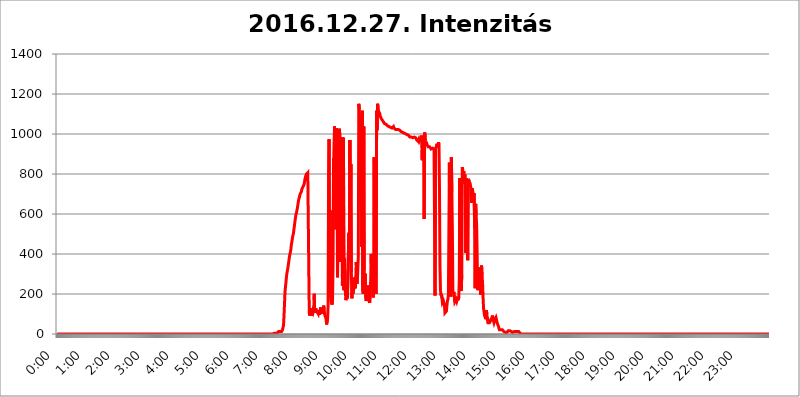
| Category | 2016.12.27. Intenzitás [W/m^2] |
|---|---|
| 0.0 | 0 |
| 0.0006944444444444445 | 0 |
| 0.001388888888888889 | 0 |
| 0.0020833333333333333 | 0 |
| 0.002777777777777778 | 0 |
| 0.003472222222222222 | 0 |
| 0.004166666666666667 | 0 |
| 0.004861111111111111 | 0 |
| 0.005555555555555556 | 0 |
| 0.0062499999999999995 | 0 |
| 0.006944444444444444 | 0 |
| 0.007638888888888889 | 0 |
| 0.008333333333333333 | 0 |
| 0.009027777777777779 | 0 |
| 0.009722222222222222 | 0 |
| 0.010416666666666666 | 0 |
| 0.011111111111111112 | 0 |
| 0.011805555555555555 | 0 |
| 0.012499999999999999 | 0 |
| 0.013194444444444444 | 0 |
| 0.013888888888888888 | 0 |
| 0.014583333333333332 | 0 |
| 0.015277777777777777 | 0 |
| 0.015972222222222224 | 0 |
| 0.016666666666666666 | 0 |
| 0.017361111111111112 | 0 |
| 0.018055555555555557 | 0 |
| 0.01875 | 0 |
| 0.019444444444444445 | 0 |
| 0.02013888888888889 | 0 |
| 0.020833333333333332 | 0 |
| 0.02152777777777778 | 0 |
| 0.022222222222222223 | 0 |
| 0.02291666666666667 | 0 |
| 0.02361111111111111 | 0 |
| 0.024305555555555556 | 0 |
| 0.024999999999999998 | 0 |
| 0.025694444444444447 | 0 |
| 0.02638888888888889 | 0 |
| 0.027083333333333334 | 0 |
| 0.027777777777777776 | 0 |
| 0.02847222222222222 | 0 |
| 0.029166666666666664 | 0 |
| 0.029861111111111113 | 0 |
| 0.030555555555555555 | 0 |
| 0.03125 | 0 |
| 0.03194444444444445 | 0 |
| 0.03263888888888889 | 0 |
| 0.03333333333333333 | 0 |
| 0.034027777777777775 | 0 |
| 0.034722222222222224 | 0 |
| 0.035416666666666666 | 0 |
| 0.036111111111111115 | 0 |
| 0.03680555555555556 | 0 |
| 0.0375 | 0 |
| 0.03819444444444444 | 0 |
| 0.03888888888888889 | 0 |
| 0.03958333333333333 | 0 |
| 0.04027777777777778 | 0 |
| 0.04097222222222222 | 0 |
| 0.041666666666666664 | 0 |
| 0.042361111111111106 | 0 |
| 0.04305555555555556 | 0 |
| 0.043750000000000004 | 0 |
| 0.044444444444444446 | 0 |
| 0.04513888888888889 | 0 |
| 0.04583333333333334 | 0 |
| 0.04652777777777778 | 0 |
| 0.04722222222222222 | 0 |
| 0.04791666666666666 | 0 |
| 0.04861111111111111 | 0 |
| 0.049305555555555554 | 0 |
| 0.049999999999999996 | 0 |
| 0.05069444444444445 | 0 |
| 0.051388888888888894 | 0 |
| 0.052083333333333336 | 0 |
| 0.05277777777777778 | 0 |
| 0.05347222222222222 | 0 |
| 0.05416666666666667 | 0 |
| 0.05486111111111111 | 0 |
| 0.05555555555555555 | 0 |
| 0.05625 | 0 |
| 0.05694444444444444 | 0 |
| 0.057638888888888885 | 0 |
| 0.05833333333333333 | 0 |
| 0.05902777777777778 | 0 |
| 0.059722222222222225 | 0 |
| 0.06041666666666667 | 0 |
| 0.061111111111111116 | 0 |
| 0.06180555555555556 | 0 |
| 0.0625 | 0 |
| 0.06319444444444444 | 0 |
| 0.06388888888888888 | 0 |
| 0.06458333333333334 | 0 |
| 0.06527777777777778 | 0 |
| 0.06597222222222222 | 0 |
| 0.06666666666666667 | 0 |
| 0.06736111111111111 | 0 |
| 0.06805555555555555 | 0 |
| 0.06874999999999999 | 0 |
| 0.06944444444444443 | 0 |
| 0.07013888888888889 | 0 |
| 0.07083333333333333 | 0 |
| 0.07152777777777779 | 0 |
| 0.07222222222222223 | 0 |
| 0.07291666666666667 | 0 |
| 0.07361111111111111 | 0 |
| 0.07430555555555556 | 0 |
| 0.075 | 0 |
| 0.07569444444444444 | 0 |
| 0.0763888888888889 | 0 |
| 0.07708333333333334 | 0 |
| 0.07777777777777778 | 0 |
| 0.07847222222222222 | 0 |
| 0.07916666666666666 | 0 |
| 0.0798611111111111 | 0 |
| 0.08055555555555556 | 0 |
| 0.08125 | 0 |
| 0.08194444444444444 | 0 |
| 0.08263888888888889 | 0 |
| 0.08333333333333333 | 0 |
| 0.08402777777777777 | 0 |
| 0.08472222222222221 | 0 |
| 0.08541666666666665 | 0 |
| 0.08611111111111112 | 0 |
| 0.08680555555555557 | 0 |
| 0.08750000000000001 | 0 |
| 0.08819444444444445 | 0 |
| 0.08888888888888889 | 0 |
| 0.08958333333333333 | 0 |
| 0.09027777777777778 | 0 |
| 0.09097222222222222 | 0 |
| 0.09166666666666667 | 0 |
| 0.09236111111111112 | 0 |
| 0.09305555555555556 | 0 |
| 0.09375 | 0 |
| 0.09444444444444444 | 0 |
| 0.09513888888888888 | 0 |
| 0.09583333333333333 | 0 |
| 0.09652777777777777 | 0 |
| 0.09722222222222222 | 0 |
| 0.09791666666666667 | 0 |
| 0.09861111111111111 | 0 |
| 0.09930555555555555 | 0 |
| 0.09999999999999999 | 0 |
| 0.10069444444444443 | 0 |
| 0.1013888888888889 | 0 |
| 0.10208333333333335 | 0 |
| 0.10277777777777779 | 0 |
| 0.10347222222222223 | 0 |
| 0.10416666666666667 | 0 |
| 0.10486111111111111 | 0 |
| 0.10555555555555556 | 0 |
| 0.10625 | 0 |
| 0.10694444444444444 | 0 |
| 0.1076388888888889 | 0 |
| 0.10833333333333334 | 0 |
| 0.10902777777777778 | 0 |
| 0.10972222222222222 | 0 |
| 0.1111111111111111 | 0 |
| 0.11180555555555556 | 0 |
| 0.11180555555555556 | 0 |
| 0.1125 | 0 |
| 0.11319444444444444 | 0 |
| 0.11388888888888889 | 0 |
| 0.11458333333333333 | 0 |
| 0.11527777777777777 | 0 |
| 0.11597222222222221 | 0 |
| 0.11666666666666665 | 0 |
| 0.1173611111111111 | 0 |
| 0.11805555555555557 | 0 |
| 0.11944444444444445 | 0 |
| 0.12013888888888889 | 0 |
| 0.12083333333333333 | 0 |
| 0.12152777777777778 | 0 |
| 0.12222222222222223 | 0 |
| 0.12291666666666667 | 0 |
| 0.12291666666666667 | 0 |
| 0.12361111111111112 | 0 |
| 0.12430555555555556 | 0 |
| 0.125 | 0 |
| 0.12569444444444444 | 0 |
| 0.12638888888888888 | 0 |
| 0.12708333333333333 | 0 |
| 0.16875 | 0 |
| 0.12847222222222224 | 0 |
| 0.12916666666666668 | 0 |
| 0.12986111111111112 | 0 |
| 0.13055555555555556 | 0 |
| 0.13125 | 0 |
| 0.13194444444444445 | 0 |
| 0.1326388888888889 | 0 |
| 0.13333333333333333 | 0 |
| 0.13402777777777777 | 0 |
| 0.13402777777777777 | 0 |
| 0.13472222222222222 | 0 |
| 0.13541666666666666 | 0 |
| 0.1361111111111111 | 0 |
| 0.13749999999999998 | 0 |
| 0.13819444444444443 | 0 |
| 0.1388888888888889 | 0 |
| 0.13958333333333334 | 0 |
| 0.14027777777777778 | 0 |
| 0.14097222222222222 | 0 |
| 0.14166666666666666 | 0 |
| 0.1423611111111111 | 0 |
| 0.14305555555555557 | 0 |
| 0.14375000000000002 | 0 |
| 0.14444444444444446 | 0 |
| 0.1451388888888889 | 0 |
| 0.1451388888888889 | 0 |
| 0.14652777777777778 | 0 |
| 0.14722222222222223 | 0 |
| 0.14791666666666667 | 0 |
| 0.1486111111111111 | 0 |
| 0.14930555555555555 | 0 |
| 0.15 | 0 |
| 0.15069444444444444 | 0 |
| 0.15138888888888888 | 0 |
| 0.15208333333333332 | 0 |
| 0.15277777777777776 | 0 |
| 0.15347222222222223 | 0 |
| 0.15416666666666667 | 0 |
| 0.15486111111111112 | 0 |
| 0.15555555555555556 | 0 |
| 0.15625 | 0 |
| 0.15694444444444444 | 0 |
| 0.15763888888888888 | 0 |
| 0.15833333333333333 | 0 |
| 0.15902777777777777 | 0 |
| 0.15972222222222224 | 0 |
| 0.16041666666666668 | 0 |
| 0.16111111111111112 | 0 |
| 0.16180555555555556 | 0 |
| 0.1625 | 0 |
| 0.16319444444444445 | 0 |
| 0.1638888888888889 | 0 |
| 0.16458333333333333 | 0 |
| 0.16527777777777777 | 0 |
| 0.16597222222222222 | 0 |
| 0.16666666666666666 | 0 |
| 0.1673611111111111 | 0 |
| 0.16805555555555554 | 0 |
| 0.16874999999999998 | 0 |
| 0.16944444444444443 | 0 |
| 0.17013888888888887 | 0 |
| 0.1708333333333333 | 0 |
| 0.17152777777777775 | 0 |
| 0.17222222222222225 | 0 |
| 0.1729166666666667 | 0 |
| 0.17361111111111113 | 0 |
| 0.17430555555555557 | 0 |
| 0.17500000000000002 | 0 |
| 0.17569444444444446 | 0 |
| 0.1763888888888889 | 0 |
| 0.17708333333333334 | 0 |
| 0.17777777777777778 | 0 |
| 0.17847222222222223 | 0 |
| 0.17916666666666667 | 0 |
| 0.1798611111111111 | 0 |
| 0.18055555555555555 | 0 |
| 0.18125 | 0 |
| 0.18194444444444444 | 0 |
| 0.1826388888888889 | 0 |
| 0.18333333333333335 | 0 |
| 0.1840277777777778 | 0 |
| 0.18472222222222223 | 0 |
| 0.18541666666666667 | 0 |
| 0.18611111111111112 | 0 |
| 0.18680555555555556 | 0 |
| 0.1875 | 0 |
| 0.18819444444444444 | 0 |
| 0.18888888888888888 | 0 |
| 0.18958333333333333 | 0 |
| 0.19027777777777777 | 0 |
| 0.1909722222222222 | 0 |
| 0.19166666666666665 | 0 |
| 0.19236111111111112 | 0 |
| 0.19305555555555554 | 0 |
| 0.19375 | 0 |
| 0.19444444444444445 | 0 |
| 0.1951388888888889 | 0 |
| 0.19583333333333333 | 0 |
| 0.19652777777777777 | 0 |
| 0.19722222222222222 | 0 |
| 0.19791666666666666 | 0 |
| 0.1986111111111111 | 0 |
| 0.19930555555555554 | 0 |
| 0.19999999999999998 | 0 |
| 0.20069444444444443 | 0 |
| 0.20138888888888887 | 0 |
| 0.2020833333333333 | 0 |
| 0.2027777777777778 | 0 |
| 0.2034722222222222 | 0 |
| 0.2041666666666667 | 0 |
| 0.20486111111111113 | 0 |
| 0.20555555555555557 | 0 |
| 0.20625000000000002 | 0 |
| 0.20694444444444446 | 0 |
| 0.2076388888888889 | 0 |
| 0.20833333333333334 | 0 |
| 0.20902777777777778 | 0 |
| 0.20972222222222223 | 0 |
| 0.21041666666666667 | 0 |
| 0.2111111111111111 | 0 |
| 0.21180555555555555 | 0 |
| 0.2125 | 0 |
| 0.21319444444444444 | 0 |
| 0.2138888888888889 | 0 |
| 0.21458333333333335 | 0 |
| 0.2152777777777778 | 0 |
| 0.21597222222222223 | 0 |
| 0.21666666666666667 | 0 |
| 0.21736111111111112 | 0 |
| 0.21805555555555556 | 0 |
| 0.21875 | 0 |
| 0.21944444444444444 | 0 |
| 0.22013888888888888 | 0 |
| 0.22083333333333333 | 0 |
| 0.22152777777777777 | 0 |
| 0.2222222222222222 | 0 |
| 0.22291666666666665 | 0 |
| 0.2236111111111111 | 0 |
| 0.22430555555555556 | 0 |
| 0.225 | 0 |
| 0.22569444444444445 | 0 |
| 0.2263888888888889 | 0 |
| 0.22708333333333333 | 0 |
| 0.22777777777777777 | 0 |
| 0.22847222222222222 | 0 |
| 0.22916666666666666 | 0 |
| 0.2298611111111111 | 0 |
| 0.23055555555555554 | 0 |
| 0.23124999999999998 | 0 |
| 0.23194444444444443 | 0 |
| 0.23263888888888887 | 0 |
| 0.2333333333333333 | 0 |
| 0.2340277777777778 | 0 |
| 0.2347222222222222 | 0 |
| 0.2354166666666667 | 0 |
| 0.23611111111111113 | 0 |
| 0.23680555555555557 | 0 |
| 0.23750000000000002 | 0 |
| 0.23819444444444446 | 0 |
| 0.2388888888888889 | 0 |
| 0.23958333333333334 | 0 |
| 0.24027777777777778 | 0 |
| 0.24097222222222223 | 0 |
| 0.24166666666666667 | 0 |
| 0.2423611111111111 | 0 |
| 0.24305555555555555 | 0 |
| 0.24375 | 0 |
| 0.24444444444444446 | 0 |
| 0.24513888888888888 | 0 |
| 0.24583333333333335 | 0 |
| 0.2465277777777778 | 0 |
| 0.24722222222222223 | 0 |
| 0.24791666666666667 | 0 |
| 0.24861111111111112 | 0 |
| 0.24930555555555556 | 0 |
| 0.25 | 0 |
| 0.25069444444444444 | 0 |
| 0.2513888888888889 | 0 |
| 0.2520833333333333 | 0 |
| 0.25277777777777777 | 0 |
| 0.2534722222222222 | 0 |
| 0.25416666666666665 | 0 |
| 0.2548611111111111 | 0 |
| 0.2555555555555556 | 0 |
| 0.25625000000000003 | 0 |
| 0.2569444444444445 | 0 |
| 0.2576388888888889 | 0 |
| 0.25833333333333336 | 0 |
| 0.2590277777777778 | 0 |
| 0.25972222222222224 | 0 |
| 0.2604166666666667 | 0 |
| 0.2611111111111111 | 0 |
| 0.26180555555555557 | 0 |
| 0.2625 | 0 |
| 0.26319444444444445 | 0 |
| 0.2638888888888889 | 0 |
| 0.26458333333333334 | 0 |
| 0.2652777777777778 | 0 |
| 0.2659722222222222 | 0 |
| 0.26666666666666666 | 0 |
| 0.2673611111111111 | 0 |
| 0.26805555555555555 | 0 |
| 0.26875 | 0 |
| 0.26944444444444443 | 0 |
| 0.2701388888888889 | 0 |
| 0.2708333333333333 | 0 |
| 0.27152777777777776 | 0 |
| 0.2722222222222222 | 0 |
| 0.27291666666666664 | 0 |
| 0.2736111111111111 | 0 |
| 0.2743055555555555 | 0 |
| 0.27499999999999997 | 0 |
| 0.27569444444444446 | 0 |
| 0.27638888888888885 | 0 |
| 0.27708333333333335 | 0 |
| 0.2777777777777778 | 0 |
| 0.27847222222222223 | 0 |
| 0.2791666666666667 | 0 |
| 0.2798611111111111 | 0 |
| 0.28055555555555556 | 0 |
| 0.28125 | 0 |
| 0.28194444444444444 | 0 |
| 0.2826388888888889 | 0 |
| 0.2833333333333333 | 0 |
| 0.28402777777777777 | 0 |
| 0.2847222222222222 | 0 |
| 0.28541666666666665 | 0 |
| 0.28611111111111115 | 0 |
| 0.28680555555555554 | 0 |
| 0.28750000000000003 | 0 |
| 0.2881944444444445 | 0 |
| 0.2888888888888889 | 0 |
| 0.28958333333333336 | 0 |
| 0.2902777777777778 | 0 |
| 0.29097222222222224 | 0 |
| 0.2916666666666667 | 0 |
| 0.2923611111111111 | 0 |
| 0.29305555555555557 | 0 |
| 0.29375 | 0 |
| 0.29444444444444445 | 0 |
| 0.2951388888888889 | 0 |
| 0.29583333333333334 | 0 |
| 0.2965277777777778 | 0 |
| 0.2972222222222222 | 0 |
| 0.29791666666666666 | 0 |
| 0.2986111111111111 | 0 |
| 0.29930555555555555 | 0 |
| 0.3 | 0 |
| 0.30069444444444443 | 0 |
| 0.3013888888888889 | 0 |
| 0.3020833333333333 | 0 |
| 0.30277777777777776 | 0 |
| 0.3034722222222222 | 3.525 |
| 0.30416666666666664 | 3.525 |
| 0.3048611111111111 | 3.525 |
| 0.3055555555555555 | 3.525 |
| 0.30624999999999997 | 3.525 |
| 0.3069444444444444 | 3.525 |
| 0.3076388888888889 | 3.525 |
| 0.30833333333333335 | 3.525 |
| 0.3090277777777778 | 3.525 |
| 0.30972222222222223 | 7.887 |
| 0.3104166666666667 | 12.257 |
| 0.3111111111111111 | 12.257 |
| 0.31180555555555556 | 12.257 |
| 0.3125 | 12.257 |
| 0.31319444444444444 | 12.257 |
| 0.3138888888888889 | 7.887 |
| 0.3145833333333333 | 12.257 |
| 0.31527777777777777 | 12.257 |
| 0.3159722222222222 | 21.024 |
| 0.31666666666666665 | 25.419 |
| 0.31736111111111115 | 43.079 |
| 0.31805555555555554 | 92.184 |
| 0.31875000000000003 | 150.964 |
| 0.3194444444444445 | 210.182 |
| 0.3201388888888889 | 237.564 |
| 0.32083333333333336 | 260.373 |
| 0.3215277777777778 | 287.709 |
| 0.32222222222222224 | 305.898 |
| 0.3229166666666667 | 319.517 |
| 0.3236111111111111 | 333.113 |
| 0.32430555555555557 | 351.198 |
| 0.325 | 369.23 |
| 0.32569444444444445 | 387.202 |
| 0.3263888888888889 | 400.638 |
| 0.32708333333333334 | 409.574 |
| 0.3277777777777778 | 427.39 |
| 0.3284722222222222 | 449.551 |
| 0.32916666666666666 | 462.786 |
| 0.3298611111111111 | 480.356 |
| 0.33055555555555555 | 493.475 |
| 0.33125 | 502.192 |
| 0.33194444444444443 | 523.88 |
| 0.3326388888888889 | 541.121 |
| 0.3333333333333333 | 562.53 |
| 0.3340277777777778 | 579.542 |
| 0.3347222222222222 | 596.45 |
| 0.3354166666666667 | 604.864 |
| 0.3361111111111111 | 617.436 |
| 0.3368055555555556 | 629.948 |
| 0.33749999999999997 | 646.537 |
| 0.33819444444444446 | 663.019 |
| 0.33888888888888885 | 675.311 |
| 0.33958333333333335 | 683.473 |
| 0.34027777777777773 | 695.666 |
| 0.34097222222222223 | 699.717 |
| 0.3416666666666666 | 699.717 |
| 0.3423611111111111 | 711.832 |
| 0.3430555555555555 | 723.889 |
| 0.34375 | 723.889 |
| 0.3444444444444445 | 727.896 |
| 0.3451388888888889 | 739.877 |
| 0.3458333333333334 | 743.859 |
| 0.34652777777777777 | 751.803 |
| 0.34722222222222227 | 771.559 |
| 0.34791666666666665 | 775.492 |
| 0.34861111111111115 | 791.169 |
| 0.34930555555555554 | 798.974 |
| 0.35000000000000003 | 802.868 |
| 0.3506944444444444 | 795.074 |
| 0.3513888888888889 | 806.757 |
| 0.3520833333333333 | 806.757 |
| 0.3527777777777778 | 802.868 |
| 0.3534722222222222 | 101.184 |
| 0.3541666666666667 | 92.184 |
| 0.3548611111111111 | 105.69 |
| 0.35555555555555557 | 128.284 |
| 0.35625 | 92.184 |
| 0.35694444444444445 | 101.184 |
| 0.3576388888888889 | 110.201 |
| 0.35833333333333334 | 119.235 |
| 0.3590277777777778 | 110.201 |
| 0.3597222222222222 | 119.235 |
| 0.36041666666666666 | 201.058 |
| 0.3611111111111111 | 105.69 |
| 0.36180555555555555 | 105.69 |
| 0.3625 | 128.284 |
| 0.36319444444444443 | 119.235 |
| 0.3638888888888889 | 114.716 |
| 0.3645833333333333 | 110.201 |
| 0.3652777777777778 | 105.69 |
| 0.3659722222222222 | 101.184 |
| 0.3666666666666667 | 119.235 |
| 0.3673611111111111 | 119.235 |
| 0.3680555555555556 | 96.682 |
| 0.36874999999999997 | 101.184 |
| 0.36944444444444446 | 132.814 |
| 0.37013888888888885 | 101.184 |
| 0.37083333333333335 | 114.716 |
| 0.37152777777777773 | 101.184 |
| 0.37222222222222223 | 110.201 |
| 0.3729166666666666 | 114.716 |
| 0.3736111111111111 | 141.884 |
| 0.3743055555555555 | 128.284 |
| 0.375 | 96.682 |
| 0.3756944444444445 | 92.184 |
| 0.3763888888888889 | 83.205 |
| 0.3770833333333334 | 74.246 |
| 0.37777777777777777 | 47.511 |
| 0.37847222222222227 | 51.951 |
| 0.37916666666666665 | 78.722 |
| 0.37986111111111115 | 137.347 |
| 0.38055555555555554 | 791.169 |
| 0.38125000000000003 | 973.772 |
| 0.3819444444444444 | 269.49 |
| 0.3826388888888889 | 617.436 |
| 0.3833333333333333 | 187.378 |
| 0.3840277777777778 | 164.605 |
| 0.3847222222222222 | 160.056 |
| 0.3854166666666667 | 146.423 |
| 0.3861111111111111 | 173.709 |
| 0.38680555555555557 | 346.682 |
| 0.3875 | 879.719 |
| 0.38819444444444445 | 868.305 |
| 0.3888888888888889 | 1037.277 |
| 0.38958333333333334 | 977.508 |
| 0.3902777777777778 | 1014.852 |
| 0.3909722222222222 | 523.88 |
| 0.39166666666666666 | 1029.798 |
| 0.3923611111111111 | 887.309 |
| 0.39305555555555555 | 283.156 |
| 0.39375 | 600.661 |
| 0.39444444444444443 | 727.896 |
| 0.3951388888888889 | 617.436 |
| 0.3958333333333333 | 1026.06 |
| 0.3965277777777778 | 966.295 |
| 0.3972222222222222 | 360.221 |
| 0.3979166666666667 | 523.88 |
| 0.3986111111111111 | 387.202 |
| 0.3993055555555556 | 984.98 |
| 0.39999999999999997 | 242.127 |
| 0.40069444444444446 | 237.564 |
| 0.40138888888888885 | 981.244 |
| 0.40208333333333335 | 219.309 |
| 0.40277777777777773 | 378.224 |
| 0.40347222222222223 | 233 |
| 0.4041666666666666 | 205.62 |
| 0.4048611111111111 | 169.156 |
| 0.4055555555555555 | 164.605 |
| 0.40625 | 196.497 |
| 0.4069444444444445 | 178.264 |
| 0.4076388888888889 | 173.709 |
| 0.4083333333333334 | 173.709 |
| 0.40902777777777777 | 506.542 |
| 0.40972222222222227 | 364.728 |
| 0.41041666666666665 | 970.034 |
| 0.41111111111111115 | 579.542 |
| 0.41180555555555554 | 849.199 |
| 0.41250000000000003 | 310.44 |
| 0.4131944444444444 | 178.264 |
| 0.4138888888888889 | 233 |
| 0.4145833333333333 | 201.058 |
| 0.4152777777777778 | 214.746 |
| 0.4159722222222222 | 223.873 |
| 0.4166666666666667 | 219.309 |
| 0.4173611111111111 | 283.156 |
| 0.41805555555555557 | 228.436 |
| 0.41875 | 283.156 |
| 0.41944444444444445 | 360.221 |
| 0.4201388888888889 | 251.251 |
| 0.42083333333333334 | 260.373 |
| 0.4215277777777778 | 260.373 |
| 0.4222222222222222 | 387.202 |
| 0.42291666666666666 | 1150.946 |
| 0.4236111111111111 | 1124.056 |
| 0.42430555555555555 | 1124.056 |
| 0.425 | 902.447 |
| 0.42569444444444443 | 1086.097 |
| 0.4263888888888889 | 898.668 |
| 0.4270833333333333 | 436.27 |
| 0.4277777777777778 | 1116.426 |
| 0.4284722222222222 | 219.309 |
| 0.4291666666666667 | 201.058 |
| 0.4298611111111111 | 1037.277 |
| 0.4305555555555556 | 319.517 |
| 0.43124999999999997 | 223.873 |
| 0.43194444444444446 | 301.354 |
| 0.43263888888888885 | 182.82 |
| 0.43333333333333335 | 164.605 |
| 0.43402777777777773 | 201.058 |
| 0.43472222222222223 | 233 |
| 0.4354166666666666 | 210.182 |
| 0.4361111111111111 | 242.127 |
| 0.4368055555555555 | 182.82 |
| 0.4375 | 164.605 |
| 0.4381944444444445 | 155.509 |
| 0.4388888888888889 | 155.509 |
| 0.4395833333333334 | 260.373 |
| 0.44027777777777777 | 400.638 |
| 0.44097222222222227 | 287.709 |
| 0.44166666666666665 | 342.162 |
| 0.44236111111111115 | 264.932 |
| 0.44305555555555554 | 182.82 |
| 0.44375000000000003 | 237.564 |
| 0.4444444444444444 | 883.516 |
| 0.4451388888888889 | 219.309 |
| 0.4458333333333333 | 233 |
| 0.4465277777777778 | 219.309 |
| 0.4472222222222222 | 201.058 |
| 0.4479166666666667 | 1116.426 |
| 0.4486111111111111 | 1018.587 |
| 0.44930555555555557 | 1150.946 |
| 0.45 | 1131.708 |
| 0.45069444444444445 | 1112.618 |
| 0.4513888888888889 | 1116.426 |
| 0.45208333333333334 | 1105.019 |
| 0.4527777777777778 | 1093.653 |
| 0.4534722222222222 | 1086.097 |
| 0.45416666666666666 | 1078.555 |
| 0.4548611111111111 | 1074.789 |
| 0.45555555555555555 | 1071.027 |
| 0.45625 | 1067.267 |
| 0.45694444444444443 | 1063.51 |
| 0.4576388888888889 | 1059.756 |
| 0.4583333333333333 | 1059.756 |
| 0.4590277777777778 | 1052.255 |
| 0.4597222222222222 | 1052.255 |
| 0.4604166666666667 | 1052.255 |
| 0.4611111111111111 | 1048.508 |
| 0.4618055555555556 | 1044.762 |
| 0.46249999999999997 | 1044.762 |
| 0.46319444444444446 | 1041.019 |
| 0.46388888888888885 | 1041.019 |
| 0.46458333333333335 | 1037.277 |
| 0.46527777777777773 | 1037.277 |
| 0.46597222222222223 | 1037.277 |
| 0.4666666666666666 | 1033.537 |
| 0.4673611111111111 | 1033.537 |
| 0.4680555555555555 | 1033.537 |
| 0.46875 | 1033.537 |
| 0.4694444444444445 | 1029.798 |
| 0.4701388888888889 | 1029.798 |
| 0.4708333333333334 | 1029.798 |
| 0.47152777777777777 | 1037.277 |
| 0.47222222222222227 | 1029.798 |
| 0.47291666666666665 | 1029.798 |
| 0.47361111111111115 | 1026.06 |
| 0.47430555555555554 | 1022.323 |
| 0.47500000000000003 | 1026.06 |
| 0.4756944444444444 | 1022.323 |
| 0.4763888888888889 | 1022.323 |
| 0.4770833333333333 | 1018.587 |
| 0.4777777777777778 | 1022.323 |
| 0.4784722222222222 | 1022.323 |
| 0.4791666666666667 | 1018.587 |
| 0.4798611111111111 | 1018.587 |
| 0.48055555555555557 | 1018.587 |
| 0.48125 | 1018.587 |
| 0.48194444444444445 | 1014.852 |
| 0.4826388888888889 | 1011.118 |
| 0.48333333333333334 | 1011.118 |
| 0.4840277777777778 | 1011.118 |
| 0.4847222222222222 | 1007.383 |
| 0.48541666666666666 | 1007.383 |
| 0.4861111111111111 | 1007.383 |
| 0.48680555555555555 | 1003.65 |
| 0.4875 | 1003.65 |
| 0.48819444444444443 | 1003.65 |
| 0.4888888888888889 | 999.916 |
| 0.4895833333333333 | 999.916 |
| 0.4902777777777778 | 996.182 |
| 0.4909722222222222 | 996.182 |
| 0.4916666666666667 | 992.448 |
| 0.4923611111111111 | 992.448 |
| 0.4930555555555556 | 992.448 |
| 0.49374999999999997 | 988.714 |
| 0.49444444444444446 | 984.98 |
| 0.49513888888888885 | 984.98 |
| 0.49583333333333335 | 984.98 |
| 0.49652777777777773 | 984.98 |
| 0.49722222222222223 | 981.244 |
| 0.4979166666666666 | 984.98 |
| 0.4986111111111111 | 981.244 |
| 0.4993055555555555 | 977.508 |
| 0.5 | 981.244 |
| 0.5006944444444444 | 984.98 |
| 0.5013888888888889 | 984.98 |
| 0.5020833333333333 | 984.98 |
| 0.5027777777777778 | 981.244 |
| 0.5034722222222222 | 977.508 |
| 0.5041666666666667 | 970.034 |
| 0.5048611111111111 | 970.034 |
| 0.5055555555555555 | 970.034 |
| 0.50625 | 962.555 |
| 0.5069444444444444 | 970.034 |
| 0.5076388888888889 | 962.555 |
| 0.5083333333333333 | 962.555 |
| 0.5090277777777777 | 962.555 |
| 0.5097222222222222 | 977.508 |
| 0.5104166666666666 | 992.448 |
| 0.5111111111111112 | 977.508 |
| 0.5118055555555555 | 868.305 |
| 0.5125000000000001 | 984.98 |
| 0.5131944444444444 | 977.508 |
| 0.513888888888889 | 925.06 |
| 0.5145833333333333 | 575.299 |
| 0.5152777777777778 | 1007.383 |
| 0.5159722222222222 | 984.98 |
| 0.5166666666666667 | 966.295 |
| 0.517361111111111 | 962.555 |
| 0.5180555555555556 | 955.071 |
| 0.5187499999999999 | 947.58 |
| 0.5194444444444445 | 943.832 |
| 0.5201388888888888 | 936.33 |
| 0.5208333333333334 | 936.33 |
| 0.5215277777777778 | 940.082 |
| 0.5222222222222223 | 936.33 |
| 0.5229166666666667 | 932.576 |
| 0.5236111111111111 | 932.576 |
| 0.5243055555555556 | 925.06 |
| 0.525 | 928.819 |
| 0.5256944444444445 | 928.819 |
| 0.5263888888888889 | 928.819 |
| 0.5270833333333333 | 925.06 |
| 0.5277777777777778 | 925.06 |
| 0.5284722222222222 | 925.06 |
| 0.5291666666666667 | 925.06 |
| 0.5298611111111111 | 191.937 |
| 0.5305555555555556 | 925.06 |
| 0.53125 | 932.576 |
| 0.5319444444444444 | 940.082 |
| 0.5326388888888889 | 951.327 |
| 0.5333333333333333 | 932.576 |
| 0.5340277777777778 | 943.832 |
| 0.5347222222222222 | 958.814 |
| 0.5354166666666667 | 947.58 |
| 0.5361111111111111 | 727.896 |
| 0.5368055555555555 | 337.639 |
| 0.5375 | 219.309 |
| 0.5381944444444444 | 191.937 |
| 0.5388888888888889 | 201.058 |
| 0.5395833333333333 | 178.264 |
| 0.5402777777777777 | 155.509 |
| 0.5409722222222222 | 160.056 |
| 0.5416666666666666 | 164.605 |
| 0.5423611111111112 | 164.605 |
| 0.5430555555555555 | 146.423 |
| 0.5437500000000001 | 105.69 |
| 0.5444444444444444 | 101.184 |
| 0.545138888888889 | 110.201 |
| 0.5458333333333333 | 114.716 |
| 0.5465277777777778 | 141.884 |
| 0.5472222222222222 | 164.605 |
| 0.5479166666666667 | 173.709 |
| 0.548611111111111 | 196.497 |
| 0.5493055555555556 | 191.937 |
| 0.5499999999999999 | 856.855 |
| 0.5506944444444445 | 205.62 |
| 0.5513888888888888 | 251.251 |
| 0.5520833333333334 | 187.378 |
| 0.5527777777777778 | 883.516 |
| 0.5534722222222223 | 711.832 |
| 0.5541666666666667 | 523.88 |
| 0.5548611111111111 | 219.309 |
| 0.5555555555555556 | 201.058 |
| 0.55625 | 210.182 |
| 0.5569444444444445 | 210.182 |
| 0.5576388888888889 | 160.056 |
| 0.5583333333333333 | 164.605 |
| 0.5590277777777778 | 160.056 |
| 0.5597222222222222 | 173.709 |
| 0.5604166666666667 | 164.605 |
| 0.5611111111111111 | 164.605 |
| 0.5618055555555556 | 182.82 |
| 0.5625 | 169.156 |
| 0.5631944444444444 | 187.378 |
| 0.5638888888888889 | 274.047 |
| 0.5645833333333333 | 779.42 |
| 0.5652777777777778 | 292.259 |
| 0.5659722222222222 | 237.564 |
| 0.5666666666666667 | 214.746 |
| 0.5673611111111111 | 296.808 |
| 0.5680555555555555 | 833.834 |
| 0.56875 | 818.392 |
| 0.5694444444444444 | 783.342 |
| 0.5701388888888889 | 814.519 |
| 0.5708333333333333 | 751.803 |
| 0.5715277777777777 | 798.974 |
| 0.5722222222222222 | 767.62 |
| 0.5729166666666666 | 405.108 |
| 0.5736111111111112 | 779.42 |
| 0.5743055555555555 | 759.723 |
| 0.5750000000000001 | 763.674 |
| 0.5756944444444444 | 369.23 |
| 0.576388888888889 | 775.492 |
| 0.5770833333333333 | 775.492 |
| 0.5777777777777778 | 763.674 |
| 0.5784722222222222 | 759.723 |
| 0.5791666666666667 | 751.803 |
| 0.579861111111111 | 735.89 |
| 0.5805555555555556 | 727.896 |
| 0.5812499999999999 | 654.791 |
| 0.5819444444444445 | 727.896 |
| 0.5826388888888888 | 715.858 |
| 0.5833333333333334 | 711.832 |
| 0.5840277777777778 | 691.608 |
| 0.5847222222222223 | 703.762 |
| 0.5854166666666667 | 528.2 |
| 0.5861111111111111 | 228.436 |
| 0.5868055555555556 | 650.667 |
| 0.5875 | 592.233 |
| 0.5881944444444445 | 549.704 |
| 0.5888888888888889 | 405.108 |
| 0.5895833333333333 | 219.309 |
| 0.5902777777777778 | 324.052 |
| 0.5909722222222222 | 251.251 |
| 0.5916666666666667 | 319.517 |
| 0.5923611111111111 | 314.98 |
| 0.5930555555555556 | 333.113 |
| 0.59375 | 196.497 |
| 0.5944444444444444 | 201.058 |
| 0.5951388888888889 | 342.162 |
| 0.5958333333333333 | 287.709 |
| 0.5965277777777778 | 255.813 |
| 0.5972222222222222 | 182.82 |
| 0.5979166666666667 | 128.284 |
| 0.5986111111111111 | 123.758 |
| 0.5993055555555555 | 92.184 |
| 0.6 | 92.184 |
| 0.6006944444444444 | 96.682 |
| 0.6013888888888889 | 74.246 |
| 0.6020833333333333 | 119.235 |
| 0.6027777777777777 | 74.246 |
| 0.6034722222222222 | 83.205 |
| 0.6041666666666666 | 56.398 |
| 0.6048611111111112 | 56.398 |
| 0.6055555555555555 | 51.951 |
| 0.6062500000000001 | 56.398 |
| 0.6069444444444444 | 56.398 |
| 0.607638888888889 | 65.31 |
| 0.6083333333333333 | 60.85 |
| 0.6090277777777778 | 65.31 |
| 0.6097222222222222 | 83.205 |
| 0.6104166666666667 | 92.184 |
| 0.611111111111111 | 74.246 |
| 0.6118055555555556 | 69.775 |
| 0.6124999999999999 | 56.398 |
| 0.6131944444444445 | 65.31 |
| 0.6138888888888888 | 74.246 |
| 0.6145833333333334 | 78.722 |
| 0.6152777777777778 | 83.205 |
| 0.6159722222222223 | 78.722 |
| 0.6166666666666667 | 60.85 |
| 0.6173611111111111 | 51.951 |
| 0.6180555555555556 | 47.511 |
| 0.61875 | 38.653 |
| 0.6194444444444445 | 29.823 |
| 0.6201388888888889 | 21.024 |
| 0.6208333333333333 | 21.024 |
| 0.6215277777777778 | 21.024 |
| 0.6222222222222222 | 21.024 |
| 0.6229166666666667 | 21.024 |
| 0.6236111111111111 | 21.024 |
| 0.6243055555555556 | 21.024 |
| 0.625 | 21.024 |
| 0.6256944444444444 | 16.636 |
| 0.6263888888888889 | 12.257 |
| 0.6270833333333333 | 12.257 |
| 0.6277777777777778 | 7.887 |
| 0.6284722222222222 | 7.887 |
| 0.6291666666666667 | 7.887 |
| 0.6298611111111111 | 7.887 |
| 0.6305555555555555 | 7.887 |
| 0.63125 | 12.257 |
| 0.6319444444444444 | 12.257 |
| 0.6326388888888889 | 16.636 |
| 0.6333333333333333 | 16.636 |
| 0.6340277777777777 | 16.636 |
| 0.6347222222222222 | 16.636 |
| 0.6354166666666666 | 12.257 |
| 0.6361111111111112 | 12.257 |
| 0.6368055555555555 | 12.257 |
| 0.6375000000000001 | 7.887 |
| 0.6381944444444444 | 7.887 |
| 0.638888888888889 | 7.887 |
| 0.6395833333333333 | 7.887 |
| 0.6402777777777778 | 7.887 |
| 0.6409722222222222 | 12.257 |
| 0.6416666666666667 | 12.257 |
| 0.642361111111111 | 12.257 |
| 0.6430555555555556 | 12.257 |
| 0.6437499999999999 | 12.257 |
| 0.6444444444444445 | 12.257 |
| 0.6451388888888888 | 12.257 |
| 0.6458333333333334 | 16.636 |
| 0.6465277777777778 | 16.636 |
| 0.6472222222222223 | 12.257 |
| 0.6479166666666667 | 12.257 |
| 0.6486111111111111 | 7.887 |
| 0.6493055555555556 | 3.525 |
| 0.65 | 3.525 |
| 0.6506944444444445 | 0 |
| 0.6513888888888889 | 0 |
| 0.6520833333333333 | 0 |
| 0.6527777777777778 | 0 |
| 0.6534722222222222 | 0 |
| 0.6541666666666667 | 0 |
| 0.6548611111111111 | 0 |
| 0.6555555555555556 | 0 |
| 0.65625 | 0 |
| 0.6569444444444444 | 0 |
| 0.6576388888888889 | 0 |
| 0.6583333333333333 | 0 |
| 0.6590277777777778 | 0 |
| 0.6597222222222222 | 0 |
| 0.6604166666666667 | 0 |
| 0.6611111111111111 | 0 |
| 0.6618055555555555 | 0 |
| 0.6625 | 0 |
| 0.6631944444444444 | 0 |
| 0.6638888888888889 | 0 |
| 0.6645833333333333 | 0 |
| 0.6652777777777777 | 0 |
| 0.6659722222222222 | 0 |
| 0.6666666666666666 | 0 |
| 0.6673611111111111 | 0 |
| 0.6680555555555556 | 0 |
| 0.6687500000000001 | 0 |
| 0.6694444444444444 | 0 |
| 0.6701388888888888 | 0 |
| 0.6708333333333334 | 0 |
| 0.6715277777777778 | 0 |
| 0.6722222222222222 | 0 |
| 0.6729166666666666 | 0 |
| 0.6736111111111112 | 0 |
| 0.6743055555555556 | 0 |
| 0.6749999999999999 | 0 |
| 0.6756944444444444 | 0 |
| 0.6763888888888889 | 0 |
| 0.6770833333333334 | 0 |
| 0.6777777777777777 | 0 |
| 0.6784722222222223 | 0 |
| 0.6791666666666667 | 0 |
| 0.6798611111111111 | 0 |
| 0.6805555555555555 | 0 |
| 0.68125 | 0 |
| 0.6819444444444445 | 0 |
| 0.6826388888888889 | 0 |
| 0.6833333333333332 | 0 |
| 0.6840277777777778 | 0 |
| 0.6847222222222222 | 0 |
| 0.6854166666666667 | 0 |
| 0.686111111111111 | 0 |
| 0.6868055555555556 | 0 |
| 0.6875 | 0 |
| 0.6881944444444444 | 0 |
| 0.688888888888889 | 0 |
| 0.6895833333333333 | 0 |
| 0.6902777777777778 | 0 |
| 0.6909722222222222 | 0 |
| 0.6916666666666668 | 0 |
| 0.6923611111111111 | 0 |
| 0.6930555555555555 | 0 |
| 0.69375 | 0 |
| 0.6944444444444445 | 0 |
| 0.6951388888888889 | 0 |
| 0.6958333333333333 | 0 |
| 0.6965277777777777 | 0 |
| 0.6972222222222223 | 0 |
| 0.6979166666666666 | 0 |
| 0.6986111111111111 | 0 |
| 0.6993055555555556 | 0 |
| 0.7000000000000001 | 0 |
| 0.7006944444444444 | 0 |
| 0.7013888888888888 | 0 |
| 0.7020833333333334 | 0 |
| 0.7027777777777778 | 0 |
| 0.7034722222222222 | 0 |
| 0.7041666666666666 | 0 |
| 0.7048611111111112 | 0 |
| 0.7055555555555556 | 0 |
| 0.7062499999999999 | 0 |
| 0.7069444444444444 | 0 |
| 0.7076388888888889 | 0 |
| 0.7083333333333334 | 0 |
| 0.7090277777777777 | 0 |
| 0.7097222222222223 | 0 |
| 0.7104166666666667 | 0 |
| 0.7111111111111111 | 0 |
| 0.7118055555555555 | 0 |
| 0.7125 | 0 |
| 0.7131944444444445 | 0 |
| 0.7138888888888889 | 0 |
| 0.7145833333333332 | 0 |
| 0.7152777777777778 | 0 |
| 0.7159722222222222 | 0 |
| 0.7166666666666667 | 0 |
| 0.717361111111111 | 0 |
| 0.7180555555555556 | 0 |
| 0.71875 | 0 |
| 0.7194444444444444 | 0 |
| 0.720138888888889 | 0 |
| 0.7208333333333333 | 0 |
| 0.7215277777777778 | 0 |
| 0.7222222222222222 | 0 |
| 0.7229166666666668 | 0 |
| 0.7236111111111111 | 0 |
| 0.7243055555555555 | 0 |
| 0.725 | 0 |
| 0.7256944444444445 | 0 |
| 0.7263888888888889 | 0 |
| 0.7270833333333333 | 0 |
| 0.7277777777777777 | 0 |
| 0.7284722222222223 | 0 |
| 0.7291666666666666 | 0 |
| 0.7298611111111111 | 0 |
| 0.7305555555555556 | 0 |
| 0.7312500000000001 | 0 |
| 0.7319444444444444 | 0 |
| 0.7326388888888888 | 0 |
| 0.7333333333333334 | 0 |
| 0.7340277777777778 | 0 |
| 0.7347222222222222 | 0 |
| 0.7354166666666666 | 0 |
| 0.7361111111111112 | 0 |
| 0.7368055555555556 | 0 |
| 0.7374999999999999 | 0 |
| 0.7381944444444444 | 0 |
| 0.7388888888888889 | 0 |
| 0.7395833333333334 | 0 |
| 0.7402777777777777 | 0 |
| 0.7409722222222223 | 0 |
| 0.7416666666666667 | 0 |
| 0.7423611111111111 | 0 |
| 0.7430555555555555 | 0 |
| 0.74375 | 0 |
| 0.7444444444444445 | 0 |
| 0.7451388888888889 | 0 |
| 0.7458333333333332 | 0 |
| 0.7465277777777778 | 0 |
| 0.7472222222222222 | 0 |
| 0.7479166666666667 | 0 |
| 0.748611111111111 | 0 |
| 0.7493055555555556 | 0 |
| 0.75 | 0 |
| 0.7506944444444444 | 0 |
| 0.751388888888889 | 0 |
| 0.7520833333333333 | 0 |
| 0.7527777777777778 | 0 |
| 0.7534722222222222 | 0 |
| 0.7541666666666668 | 0 |
| 0.7548611111111111 | 0 |
| 0.7555555555555555 | 0 |
| 0.75625 | 0 |
| 0.7569444444444445 | 0 |
| 0.7576388888888889 | 0 |
| 0.7583333333333333 | 0 |
| 0.7590277777777777 | 0 |
| 0.7597222222222223 | 0 |
| 0.7604166666666666 | 0 |
| 0.7611111111111111 | 0 |
| 0.7618055555555556 | 0 |
| 0.7625000000000001 | 0 |
| 0.7631944444444444 | 0 |
| 0.7638888888888888 | 0 |
| 0.7645833333333334 | 0 |
| 0.7652777777777778 | 0 |
| 0.7659722222222222 | 0 |
| 0.7666666666666666 | 0 |
| 0.7673611111111112 | 0 |
| 0.7680555555555556 | 0 |
| 0.7687499999999999 | 0 |
| 0.7694444444444444 | 0 |
| 0.7701388888888889 | 0 |
| 0.7708333333333334 | 0 |
| 0.7715277777777777 | 0 |
| 0.7722222222222223 | 0 |
| 0.7729166666666667 | 0 |
| 0.7736111111111111 | 0 |
| 0.7743055555555555 | 0 |
| 0.775 | 0 |
| 0.7756944444444445 | 0 |
| 0.7763888888888889 | 0 |
| 0.7770833333333332 | 0 |
| 0.7777777777777778 | 0 |
| 0.7784722222222222 | 0 |
| 0.7791666666666667 | 0 |
| 0.779861111111111 | 0 |
| 0.7805555555555556 | 0 |
| 0.78125 | 0 |
| 0.7819444444444444 | 0 |
| 0.782638888888889 | 0 |
| 0.7833333333333333 | 0 |
| 0.7840277777777778 | 0 |
| 0.7847222222222222 | 0 |
| 0.7854166666666668 | 0 |
| 0.7861111111111111 | 0 |
| 0.7868055555555555 | 0 |
| 0.7875 | 0 |
| 0.7881944444444445 | 0 |
| 0.7888888888888889 | 0 |
| 0.7895833333333333 | 0 |
| 0.7902777777777777 | 0 |
| 0.7909722222222223 | 0 |
| 0.7916666666666666 | 0 |
| 0.7923611111111111 | 0 |
| 0.7930555555555556 | 0 |
| 0.7937500000000001 | 0 |
| 0.7944444444444444 | 0 |
| 0.7951388888888888 | 0 |
| 0.7958333333333334 | 0 |
| 0.7965277777777778 | 0 |
| 0.7972222222222222 | 0 |
| 0.7979166666666666 | 0 |
| 0.7986111111111112 | 0 |
| 0.7993055555555556 | 0 |
| 0.7999999999999999 | 0 |
| 0.8006944444444444 | 0 |
| 0.8013888888888889 | 0 |
| 0.8020833333333334 | 0 |
| 0.8027777777777777 | 0 |
| 0.8034722222222223 | 0 |
| 0.8041666666666667 | 0 |
| 0.8048611111111111 | 0 |
| 0.8055555555555555 | 0 |
| 0.80625 | 0 |
| 0.8069444444444445 | 0 |
| 0.8076388888888889 | 0 |
| 0.8083333333333332 | 0 |
| 0.8090277777777778 | 0 |
| 0.8097222222222222 | 0 |
| 0.8104166666666667 | 0 |
| 0.811111111111111 | 0 |
| 0.8118055555555556 | 0 |
| 0.8125 | 0 |
| 0.8131944444444444 | 0 |
| 0.813888888888889 | 0 |
| 0.8145833333333333 | 0 |
| 0.8152777777777778 | 0 |
| 0.8159722222222222 | 0 |
| 0.8166666666666668 | 0 |
| 0.8173611111111111 | 0 |
| 0.8180555555555555 | 0 |
| 0.81875 | 0 |
| 0.8194444444444445 | 0 |
| 0.8201388888888889 | 0 |
| 0.8208333333333333 | 0 |
| 0.8215277777777777 | 0 |
| 0.8222222222222223 | 0 |
| 0.8229166666666666 | 0 |
| 0.8236111111111111 | 0 |
| 0.8243055555555556 | 0 |
| 0.8250000000000001 | 0 |
| 0.8256944444444444 | 0 |
| 0.8263888888888888 | 0 |
| 0.8270833333333334 | 0 |
| 0.8277777777777778 | 0 |
| 0.8284722222222222 | 0 |
| 0.8291666666666666 | 0 |
| 0.8298611111111112 | 0 |
| 0.8305555555555556 | 0 |
| 0.8312499999999999 | 0 |
| 0.8319444444444444 | 0 |
| 0.8326388888888889 | 0 |
| 0.8333333333333334 | 0 |
| 0.8340277777777777 | 0 |
| 0.8347222222222223 | 0 |
| 0.8354166666666667 | 0 |
| 0.8361111111111111 | 0 |
| 0.8368055555555555 | 0 |
| 0.8375 | 0 |
| 0.8381944444444445 | 0 |
| 0.8388888888888889 | 0 |
| 0.8395833333333332 | 0 |
| 0.8402777777777778 | 0 |
| 0.8409722222222222 | 0 |
| 0.8416666666666667 | 0 |
| 0.842361111111111 | 0 |
| 0.8430555555555556 | 0 |
| 0.84375 | 0 |
| 0.8444444444444444 | 0 |
| 0.845138888888889 | 0 |
| 0.8458333333333333 | 0 |
| 0.8465277777777778 | 0 |
| 0.8472222222222222 | 0 |
| 0.8479166666666668 | 0 |
| 0.8486111111111111 | 0 |
| 0.8493055555555555 | 0 |
| 0.85 | 0 |
| 0.8506944444444445 | 0 |
| 0.8513888888888889 | 0 |
| 0.8520833333333333 | 0 |
| 0.8527777777777777 | 0 |
| 0.8534722222222223 | 0 |
| 0.8541666666666666 | 0 |
| 0.8548611111111111 | 0 |
| 0.8555555555555556 | 0 |
| 0.8562500000000001 | 0 |
| 0.8569444444444444 | 0 |
| 0.8576388888888888 | 0 |
| 0.8583333333333334 | 0 |
| 0.8590277777777778 | 0 |
| 0.8597222222222222 | 0 |
| 0.8604166666666666 | 0 |
| 0.8611111111111112 | 0 |
| 0.8618055555555556 | 0 |
| 0.8624999999999999 | 0 |
| 0.8631944444444444 | 0 |
| 0.8638888888888889 | 0 |
| 0.8645833333333334 | 0 |
| 0.8652777777777777 | 0 |
| 0.8659722222222223 | 0 |
| 0.8666666666666667 | 0 |
| 0.8673611111111111 | 0 |
| 0.8680555555555555 | 0 |
| 0.86875 | 0 |
| 0.8694444444444445 | 0 |
| 0.8701388888888889 | 0 |
| 0.8708333333333332 | 0 |
| 0.8715277777777778 | 0 |
| 0.8722222222222222 | 0 |
| 0.8729166666666667 | 0 |
| 0.873611111111111 | 0 |
| 0.8743055555555556 | 0 |
| 0.875 | 0 |
| 0.8756944444444444 | 0 |
| 0.876388888888889 | 0 |
| 0.8770833333333333 | 0 |
| 0.8777777777777778 | 0 |
| 0.8784722222222222 | 0 |
| 0.8791666666666668 | 0 |
| 0.8798611111111111 | 0 |
| 0.8805555555555555 | 0 |
| 0.88125 | 0 |
| 0.8819444444444445 | 0 |
| 0.8826388888888889 | 0 |
| 0.8833333333333333 | 0 |
| 0.8840277777777777 | 0 |
| 0.8847222222222223 | 0 |
| 0.8854166666666666 | 0 |
| 0.8861111111111111 | 0 |
| 0.8868055555555556 | 0 |
| 0.8875000000000001 | 0 |
| 0.8881944444444444 | 0 |
| 0.8888888888888888 | 0 |
| 0.8895833333333334 | 0 |
| 0.8902777777777778 | 0 |
| 0.8909722222222222 | 0 |
| 0.8916666666666666 | 0 |
| 0.8923611111111112 | 0 |
| 0.8930555555555556 | 0 |
| 0.8937499999999999 | 0 |
| 0.8944444444444444 | 0 |
| 0.8951388888888889 | 0 |
| 0.8958333333333334 | 0 |
| 0.8965277777777777 | 0 |
| 0.8972222222222223 | 0 |
| 0.8979166666666667 | 0 |
| 0.8986111111111111 | 0 |
| 0.8993055555555555 | 0 |
| 0.9 | 0 |
| 0.9006944444444445 | 0 |
| 0.9013888888888889 | 0 |
| 0.9020833333333332 | 0 |
| 0.9027777777777778 | 0 |
| 0.9034722222222222 | 0 |
| 0.9041666666666667 | 0 |
| 0.904861111111111 | 0 |
| 0.9055555555555556 | 0 |
| 0.90625 | 0 |
| 0.9069444444444444 | 0 |
| 0.907638888888889 | 0 |
| 0.9083333333333333 | 0 |
| 0.9090277777777778 | 0 |
| 0.9097222222222222 | 0 |
| 0.9104166666666668 | 0 |
| 0.9111111111111111 | 0 |
| 0.9118055555555555 | 0 |
| 0.9125 | 0 |
| 0.9131944444444445 | 0 |
| 0.9138888888888889 | 0 |
| 0.9145833333333333 | 0 |
| 0.9152777777777777 | 0 |
| 0.9159722222222223 | 0 |
| 0.9166666666666666 | 0 |
| 0.9173611111111111 | 0 |
| 0.9180555555555556 | 0 |
| 0.9187500000000001 | 0 |
| 0.9194444444444444 | 0 |
| 0.9201388888888888 | 0 |
| 0.9208333333333334 | 0 |
| 0.9215277777777778 | 0 |
| 0.9222222222222222 | 0 |
| 0.9229166666666666 | 0 |
| 0.9236111111111112 | 0 |
| 0.9243055555555556 | 0 |
| 0.9249999999999999 | 0 |
| 0.9256944444444444 | 0 |
| 0.9263888888888889 | 0 |
| 0.9270833333333334 | 0 |
| 0.9277777777777777 | 0 |
| 0.9284722222222223 | 0 |
| 0.9291666666666667 | 0 |
| 0.9298611111111111 | 0 |
| 0.9305555555555555 | 0 |
| 0.93125 | 0 |
| 0.9319444444444445 | 0 |
| 0.9326388888888889 | 0 |
| 0.9333333333333332 | 0 |
| 0.9340277777777778 | 0 |
| 0.9347222222222222 | 0 |
| 0.9354166666666667 | 0 |
| 0.936111111111111 | 0 |
| 0.9368055555555556 | 0 |
| 0.9375 | 0 |
| 0.9381944444444444 | 0 |
| 0.938888888888889 | 0 |
| 0.9395833333333333 | 0 |
| 0.9402777777777778 | 0 |
| 0.9409722222222222 | 0 |
| 0.9416666666666668 | 0 |
| 0.9423611111111111 | 0 |
| 0.9430555555555555 | 0 |
| 0.94375 | 0 |
| 0.9444444444444445 | 0 |
| 0.9451388888888889 | 0 |
| 0.9458333333333333 | 0 |
| 0.9465277777777777 | 0 |
| 0.9472222222222223 | 0 |
| 0.9479166666666666 | 0 |
| 0.9486111111111111 | 0 |
| 0.9493055555555556 | 0 |
| 0.9500000000000001 | 0 |
| 0.9506944444444444 | 0 |
| 0.9513888888888888 | 0 |
| 0.9520833333333334 | 0 |
| 0.9527777777777778 | 0 |
| 0.9534722222222222 | 0 |
| 0.9541666666666666 | 0 |
| 0.9548611111111112 | 0 |
| 0.9555555555555556 | 0 |
| 0.9562499999999999 | 0 |
| 0.9569444444444444 | 0 |
| 0.9576388888888889 | 0 |
| 0.9583333333333334 | 0 |
| 0.9590277777777777 | 0 |
| 0.9597222222222223 | 0 |
| 0.9604166666666667 | 0 |
| 0.9611111111111111 | 0 |
| 0.9618055555555555 | 0 |
| 0.9625 | 0 |
| 0.9631944444444445 | 0 |
| 0.9638888888888889 | 0 |
| 0.9645833333333332 | 0 |
| 0.9652777777777778 | 0 |
| 0.9659722222222222 | 0 |
| 0.9666666666666667 | 0 |
| 0.967361111111111 | 0 |
| 0.9680555555555556 | 0 |
| 0.96875 | 0 |
| 0.9694444444444444 | 0 |
| 0.970138888888889 | 0 |
| 0.9708333333333333 | 0 |
| 0.9715277777777778 | 0 |
| 0.9722222222222222 | 0 |
| 0.9729166666666668 | 0 |
| 0.9736111111111111 | 0 |
| 0.9743055555555555 | 0 |
| 0.975 | 0 |
| 0.9756944444444445 | 0 |
| 0.9763888888888889 | 0 |
| 0.9770833333333333 | 0 |
| 0.9777777777777777 | 0 |
| 0.9784722222222223 | 0 |
| 0.9791666666666666 | 0 |
| 0.9798611111111111 | 0 |
| 0.9805555555555556 | 0 |
| 0.9812500000000001 | 0 |
| 0.9819444444444444 | 0 |
| 0.9826388888888888 | 0 |
| 0.9833333333333334 | 0 |
| 0.9840277777777778 | 0 |
| 0.9847222222222222 | 0 |
| 0.9854166666666666 | 0 |
| 0.9861111111111112 | 0 |
| 0.9868055555555556 | 0 |
| 0.9874999999999999 | 0 |
| 0.9881944444444444 | 0 |
| 0.9888888888888889 | 0 |
| 0.9895833333333334 | 0 |
| 0.9902777777777777 | 0 |
| 0.9909722222222223 | 0 |
| 0.9916666666666667 | 0 |
| 0.9923611111111111 | 0 |
| 0.9930555555555555 | 0 |
| 0.99375 | 0 |
| 0.9944444444444445 | 0 |
| 0.9951388888888889 | 0 |
| 0.9958333333333332 | 0 |
| 0.9965277777777778 | 0 |
| 0.9972222222222222 | 0 |
| 0.9979166666666667 | 0 |
| 0.998611111111111 | 0 |
| 0.9993055555555556 | 0 |